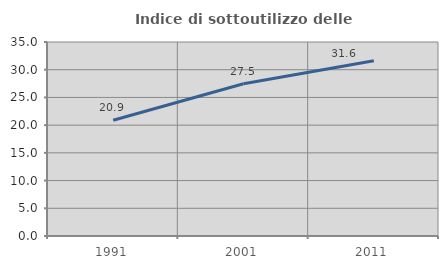
| Category | Indice di sottoutilizzo delle abitazioni  |
|---|---|
| 1991.0 | 20.895 |
| 2001.0 | 27.464 |
| 2011.0 | 31.63 |